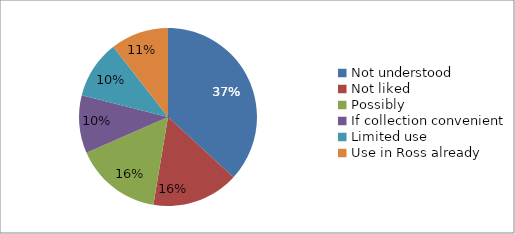
| Category | Series 1 | Series 0 |
|---|---|---|
| Not understood | 7 | 7 |
| Not liked | 3 | 3 |
| Possibly | 3 | 3 |
| If collection convenient | 2 | 2 |
| Limited use | 2 | 2 |
| Use in Ross already | 2 | 2 |